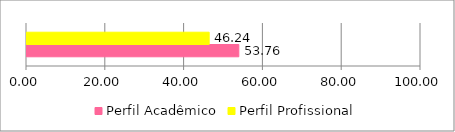
| Category | Perfil Acadêmico | Perfil Profissional |
|---|---|---|
| 0 | 53.763 | 46.237 |